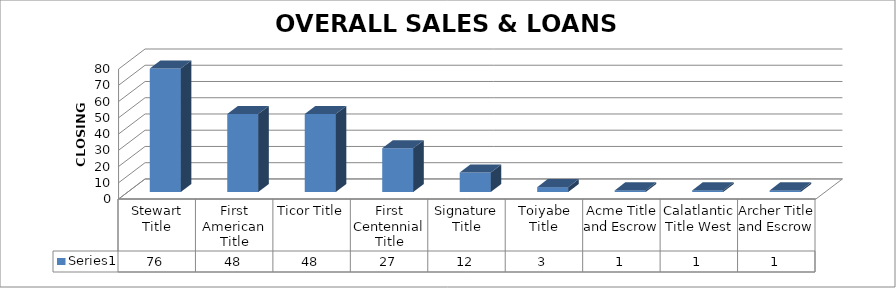
| Category | Series 0 |
|---|---|
| Stewart Title | 76 |
| First American Title | 48 |
| Ticor Title | 48 |
| First Centennial Title | 27 |
| Signature Title | 12 |
| Toiyabe Title | 3 |
| Acme Title and Escrow | 1 |
| Calatlantic Title West | 1 |
| Archer Title and Escrow | 1 |